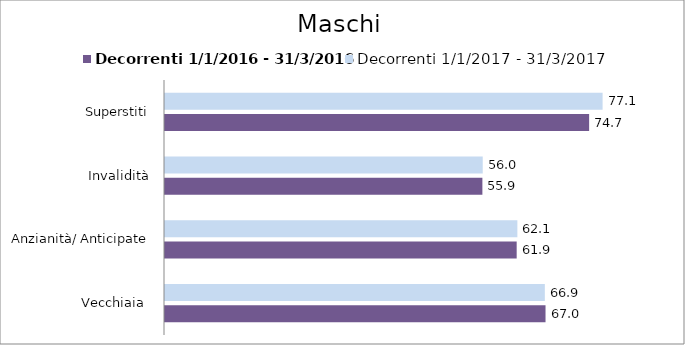
| Category | Decorrenti 1/1/2016 - 31/3/2016 | Decorrenti 1/1/2017 - 31/3/2017 |
|---|---|---|
| Vecchiaia  | 67.02 | 66.9 |
| Anzianità/ Anticipate | 61.94 | 62.06 |
| Invalidità | 55.9 | 55.96 |
| Superstiti | 74.7 | 77.07 |